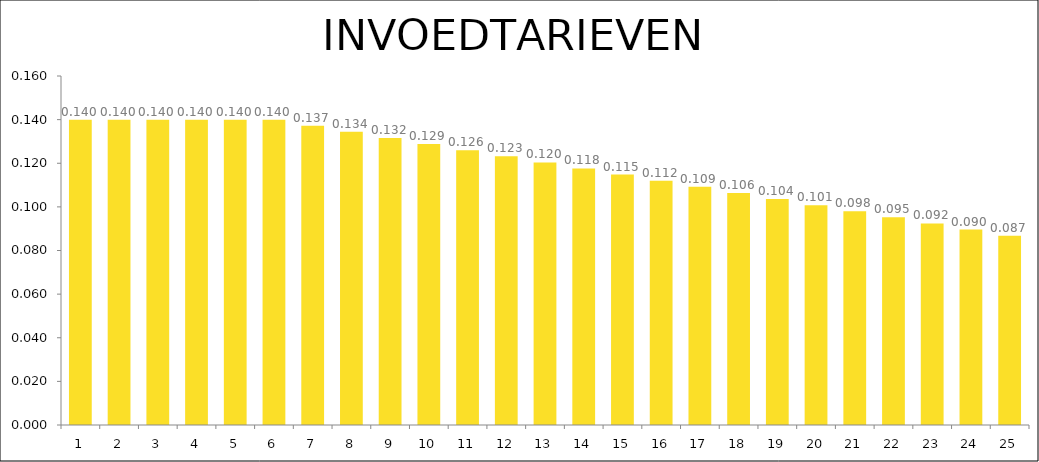
| Category | Series 0 |
|---|---|
| 0 | 0.14 |
| 1 | 0.14 |
| 2 | 0.14 |
| 3 | 0.14 |
| 4 | 0.14 |
| 5 | 0.14 |
| 6 | 0.137 |
| 7 | 0.134 |
| 8 | 0.132 |
| 9 | 0.129 |
| 10 | 0.126 |
| 11 | 0.123 |
| 12 | 0.12 |
| 13 | 0.118 |
| 14 | 0.115 |
| 15 | 0.112 |
| 16 | 0.109 |
| 17 | 0.106 |
| 18 | 0.104 |
| 19 | 0.101 |
| 20 | 0.098 |
| 21 | 0.095 |
| 22 | 0.092 |
| 23 | 0.09 |
| 24 | 0.087 |